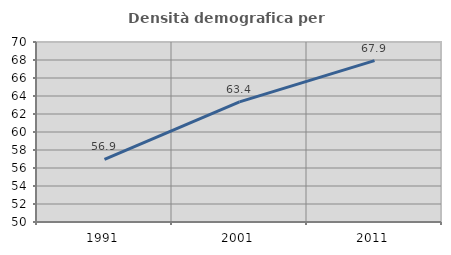
| Category | Densità demografica |
|---|---|
| 1991.0 | 56.947 |
| 2001.0 | 63.352 |
| 2011.0 | 67.937 |